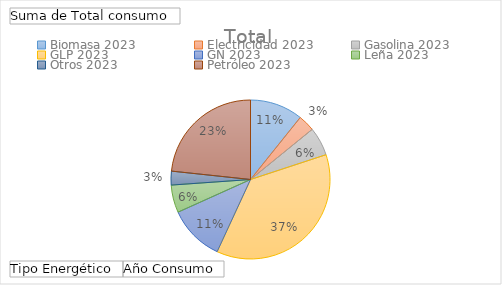
| Category | Total |
|---|---|
| 0 | 3270000 |
| 1 | 1026000 |
| 2 | 1767000 |
| 3 | 11227860 |
| 4 | 3453480 |
| 5 | 1708558.2 |
| 6 | 852000 |
| 7 | 7086240 |